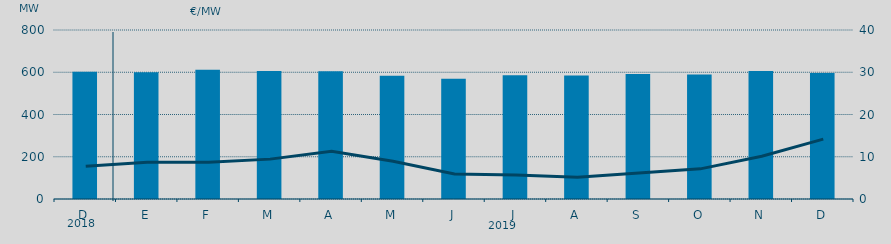
| Category | Energia (MWh) a subir |
|---|---|
| D | 602.253 |
| E | 600.235 |
| F | 612.121 |
| M | 605.978 |
| A | 604.29 |
| M | 583.379 |
| J | 569.496 |
| J | 585.727 |
| A | 584.609 |
| S | 591.64 |
| O | 589.349 |
| N | 605.422 |
| D | 596.999 |